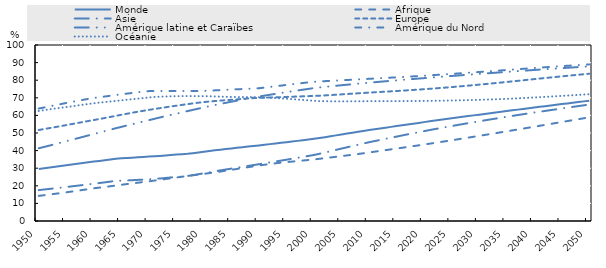
| Category | Monde | Afrique | Asie | Europe | Amérique latine et Caraïbes | Amérique du Nord | Océanie |
|---|---|---|---|---|---|---|---|
| 1950.0 | 29.607 | 14.282 | 17.534 | 51.711 | 41.298 | 63.904 | 62.511 |
| 1951.0 | 29.997 | 14.665 | 17.908 | 52.266 | 42.092 | 64.523 | 63.014 |
| 1952.0 | 30.384 | 15.059 | 18.244 | 52.811 | 42.893 | 65.162 | 63.475 |
| 1953.0 | 30.789 | 15.464 | 18.592 | 53.355 | 43.696 | 65.795 | 63.91 |
| 1954.0 | 31.207 | 15.88 | 18.95 | 53.91 | 44.506 | 66.423 | 64.332 |
| 1955.0 | 31.635 | 16.307 | 19.314 | 54.487 | 45.321 | 67.047 | 64.748 |
| 1956.0 | 32.065 | 16.745 | 19.681 | 55.068 | 46.14 | 67.663 | 65.17 |
| 1957.0 | 32.491 | 17.19 | 20.051 | 55.646 | 46.96 | 68.245 | 65.618 |
| 1958.0 | 32.918 | 17.644 | 20.427 | 56.231 | 47.783 | 68.822 | 66.056 |
| 1959.0 | 33.34 | 18.113 | 20.805 | 56.805 | 48.608 | 69.393 | 66.48 |
| 1960.0 | 33.754 | 18.59 | 21.181 | 57.367 | 49.438 | 69.919 | 66.887 |
| 1961.0 | 34.153 | 18.967 | 21.564 | 57.945 | 50.246 | 70.32 | 67.277 |
| 1962.0 | 34.56 | 19.347 | 21.97 | 58.518 | 51.065 | 70.739 | 67.589 |
| 1963.0 | 34.968 | 19.741 | 22.378 | 59.121 | 51.886 | 71.155 | 67.899 |
| 1964.0 | 35.367 | 20.149 | 22.787 | 59.725 | 52.712 | 71.567 | 68.218 |
| 1965.0 | 35.587 | 20.575 | 22.905 | 60.332 | 53.481 | 71.975 | 68.549 |
| 1966.0 | 35.797 | 20.988 | 23.035 | 60.932 | 54.248 | 72.378 | 68.892 |
| 1967.0 | 36.003 | 21.372 | 23.192 | 61.524 | 55.013 | 72.758 | 69.204 |
| 1968.0 | 36.204 | 21.763 | 23.36 | 62.093 | 55.778 | 73.134 | 69.527 |
| 1969.0 | 36.4 | 22.161 | 23.536 | 62.62 | 56.54 | 73.507 | 69.847 |
| 1970.0 | 36.595 | 22.55 | 23.72 | 63.135 | 57.296 | 73.799 | 70.161 |
| 1971.0 | 36.783 | 22.967 | 23.912 | 63.636 | 58.057 | 73.85 | 70.477 |
| 1972.0 | 36.991 | 23.4 | 24.143 | 64.124 | 58.813 | 73.85 | 70.623 |
| 1973.0 | 37.229 | 23.835 | 24.424 | 64.599 | 59.544 | 73.849 | 70.744 |
| 1974.0 | 37.496 | 24.26 | 24.754 | 65.071 | 60.268 | 73.848 | 70.841 |
| 1975.0 | 37.72 | 24.695 | 25.006 | 65.525 | 60.991 | 73.846 | 70.916 |
| 1976.0 | 37.97 | 25.14 | 25.301 | 65.959 | 61.71 | 73.845 | 70.963 |
| 1977.0 | 38.22 | 25.571 | 25.593 | 66.392 | 62.427 | 73.859 | 70.965 |
| 1978.0 | 38.549 | 26.013 | 26.011 | 66.827 | 63.141 | 73.872 | 70.952 |
| 1979.0 | 38.945 | 26.411 | 26.56 | 67.222 | 63.848 | 73.885 | 70.937 |
| 1980.0 | 39.346 | 26.794 | 27.13 | 67.573 | 64.554 | 73.93 | 70.925 |
| 1981.0 | 39.759 | 27.221 | 27.714 | 67.898 | 65.242 | 74.073 | 70.908 |
| 1982.0 | 40.143 | 27.654 | 28.267 | 68.161 | 65.897 | 74.226 | 70.781 |
| 1983.0 | 40.494 | 28.102 | 28.767 | 68.407 | 66.534 | 74.378 | 70.665 |
| 1984.0 | 40.846 | 28.576 | 29.27 | 68.637 | 67.164 | 74.53 | 70.562 |
| 1985.0 | 41.199 | 29.074 | 29.771 | 68.86 | 67.788 | 74.681 | 70.475 |
| 1986.0 | 41.554 | 29.583 | 30.274 | 69.098 | 68.397 | 74.831 | 70.413 |
| 1987.0 | 41.911 | 30.078 | 30.775 | 69.371 | 68.993 | 74.969 | 70.394 |
| 1988.0 | 42.267 | 30.562 | 31.274 | 69.639 | 69.582 | 75.105 | 70.383 |
| 1989.0 | 42.611 | 31.04 | 31.77 | 69.814 | 70.158 | 75.241 | 70.365 |
| 1990.0 | 42.961 | 31.535 | 32.272 | 69.927 | 70.717 | 75.434 | 70.336 |
| 1991.0 | 43.321 | 31.962 | 32.781 | 70.052 | 71.241 | 75.798 | 70.234 |
| 1992.0 | 43.68 | 32.378 | 33.285 | 70.166 | 71.741 | 76.182 | 70.058 |
| 1993.0 | 44.044 | 32.781 | 33.795 | 70.275 | 72.227 | 76.56 | 69.867 |
| 1994.0 | 44.411 | 33.135 | 34.312 | 70.393 | 72.718 | 76.934 | 69.667 |
| 1995.0 | 44.78 | 33.451 | 34.836 | 70.506 | 73.205 | 77.304 | 69.459 |
| 1996.0 | 45.15 | 33.753 | 35.364 | 70.617 | 73.67 | 77.673 | 69.245 |
| 1997.0 | 45.525 | 34.063 | 35.894 | 70.724 | 74.143 | 78.047 | 69.011 |
| 1998.0 | 45.906 | 34.368 | 36.43 | 70.831 | 74.613 | 78.417 | 68.772 |
| 1999.0 | 46.288 | 34.673 | 36.97 | 70.941 | 75.066 | 78.783 | 68.533 |
| 2000.0 | 46.677 | 34.982 | 37.522 | 71.057 | 75.516 | 79.104 | 68.299 |
| 2001.0 | 47.13 | 35.345 | 38.187 | 71.187 | 75.877 | 79.295 | 68.094 |
| 2002.0 | 47.631 | 35.72 | 38.926 | 71.363 | 76.207 | 79.461 | 68.046 |
| 2003.0 | 48.136 | 36.099 | 39.666 | 71.553 | 76.529 | 79.626 | 68.007 |
| 2004.0 | 48.644 | 36.481 | 40.409 | 71.749 | 76.836 | 79.79 | 67.984 |
| 2005.0 | 49.157 | 36.878 | 41.154 | 71.948 | 77.138 | 79.952 | 67.977 |
| 2006.0 | 49.661 | 37.273 | 41.881 | 72.149 | 77.437 | 80.115 | 67.989 |
| 2007.0 | 50.155 | 37.629 | 42.6 | 72.349 | 77.733 | 80.286 | 68.004 |
| 2008.0 | 50.66 | 38.057 | 43.319 | 72.549 | 78.022 | 80.457 | 68.031 |
| 2009.0 | 51.163 | 38.491 | 44.035 | 72.747 | 78.304 | 80.625 | 68.058 |
| 2010.0 | 51.664 | 38.934 | 44.75 | 72.938 | 78.583 | 80.793 | 68.078 |
| 2011.0 | 52.129 | 39.383 | 45.407 | 73.128 | 78.859 | 80.963 | 68.091 |
| 2012.0 | 52.578 | 39.822 | 46.046 | 73.309 | 79.13 | 81.125 | 68.102 |
| 2013.0 | 53.026 | 40.262 | 46.684 | 73.492 | 79.396 | 81.291 | 68.108 |
| 2014.0 | 53.475 | 40.707 | 47.321 | 73.673 | 79.659 | 81.46 | 68.114 |
| 2015.0 | 53.928 | 41.154 | 47.962 | 73.858 | 79.919 | 81.633 | 68.122 |
| 2016.0 | 54.382 | 41.604 | 48.6 | 74.048 | 80.176 | 81.809 | 68.134 |
| 2017.0 | 54.835 | 42.059 | 49.234 | 74.246 | 80.43 | 81.99 | 68.151 |
| 2018.0 | 55.285 | 42.518 | 49.858 | 74.451 | 80.682 | 82.174 | 68.173 |
| 2019.0 | 55.731 | 42.983 | 50.472 | 74.664 | 80.933 | 82.363 | 68.2 |
| 2020.0 | 56.173 | 43.452 | 51.076 | 74.885 | 81.181 | 82.556 | 68.232 |
| 2021.0 | 56.611 | 43.925 | 51.669 | 75.112 | 81.428 | 82.752 | 68.267 |
| 2022.0 | 57.046 | 44.403 | 52.253 | 75.346 | 81.673 | 82.952 | 68.308 |
| 2023.0 | 57.476 | 44.886 | 52.827 | 75.588 | 81.917 | 83.155 | 68.353 |
| 2024.0 | 57.904 | 45.372 | 53.393 | 75.837 | 82.158 | 83.361 | 68.405 |
| 2025.0 | 58.33 | 45.863 | 53.952 | 76.093 | 82.399 | 83.571 | 68.463 |
| 2026.0 | 58.753 | 46.357 | 54.504 | 76.356 | 82.637 | 83.783 | 68.527 |
| 2027.0 | 59.175 | 46.856 | 55.05 | 76.626 | 82.874 | 83.998 | 68.599 |
| 2028.0 | 59.594 | 47.357 | 55.59 | 76.903 | 83.11 | 84.216 | 68.677 |
| 2029.0 | 60.012 | 47.863 | 56.123 | 77.186 | 83.344 | 84.435 | 68.762 |
| 2030.0 | 60.427 | 48.371 | 56.65 | 77.475 | 83.576 | 84.657 | 68.853 |
| 2031.0 | 60.841 | 48.882 | 57.172 | 77.769 | 83.807 | 84.881 | 68.951 |
| 2032.0 | 61.252 | 49.396 | 57.689 | 78.069 | 84.036 | 85.107 | 69.055 |
| 2033.0 | 61.662 | 49.911 | 58.2 | 78.374 | 84.264 | 85.334 | 69.167 |
| 2034.0 | 62.07 | 50.429 | 58.706 | 78.684 | 84.491 | 85.562 | 69.287 |
| 2035.0 | 62.476 | 50.948 | 59.207 | 78.997 | 84.716 | 85.791 | 69.415 |
| 2036.0 | 62.88 | 51.467 | 59.702 | 79.315 | 84.939 | 86.02 | 69.552 |
| 2037.0 | 63.282 | 51.989 | 60.192 | 79.635 | 85.16 | 86.247 | 69.698 |
| 2038.0 | 63.681 | 52.515 | 60.676 | 79.957 | 85.38 | 86.472 | 69.852 |
| 2039.0 | 64.079 | 53.042 | 61.154 | 80.28 | 85.597 | 86.695 | 70.013 |
| 2040.0 | 64.474 | 53.571 | 61.627 | 80.604 | 85.812 | 86.915 | 70.179 |
| 2041.0 | 64.866 | 54.102 | 62.093 | 80.927 | 86.025 | 87.133 | 70.35 |
| 2042.0 | 65.256 | 54.636 | 62.554 | 81.247 | 86.237 | 87.349 | 70.527 |
| 2043.0 | 65.643 | 55.169 | 63.008 | 81.564 | 86.446 | 87.561 | 70.707 |
| 2044.0 | 66.031 | 55.703 | 63.463 | 81.877 | 86.653 | 87.771 | 70.89 |
| 2045.0 | 66.418 | 56.237 | 63.918 | 82.186 | 86.858 | 87.977 | 71.077 |
| 2046.0 | 66.806 | 56.771 | 64.372 | 82.491 | 87.06 | 88.181 | 71.267 |
| 2047.0 | 67.194 | 57.306 | 64.825 | 82.792 | 87.261 | 88.381 | 71.461 |
| 2048.0 | 67.582 | 57.84 | 65.278 | 83.09 | 87.459 | 88.579 | 71.657 |
| 2049.0 | 67.97 | 58.374 | 65.73 | 83.383 | 87.654 | 88.773 | 71.856 |
| 2050.0 | 68.357 | 58.907 | 66.18 | 83.672 | 87.847 | 88.965 | 72.057 |